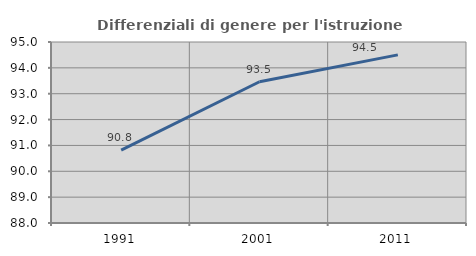
| Category | Differenziali di genere per l'istruzione superiore |
|---|---|
| 1991.0 | 90.819 |
| 2001.0 | 93.462 |
| 2011.0 | 94.502 |